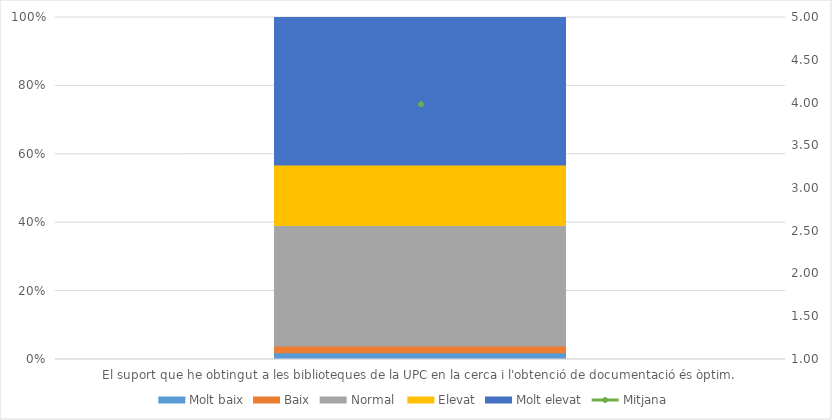
| Category | Molt baix | Baix | Normal  | Elevat | Molt elevat |
|---|---|---|---|---|---|
| El suport que he obtingut a les biblioteques de la UPC en la cerca i l'obtenció de documentació és òptim. | 1 | 1 | 18 | 9 | 22 |